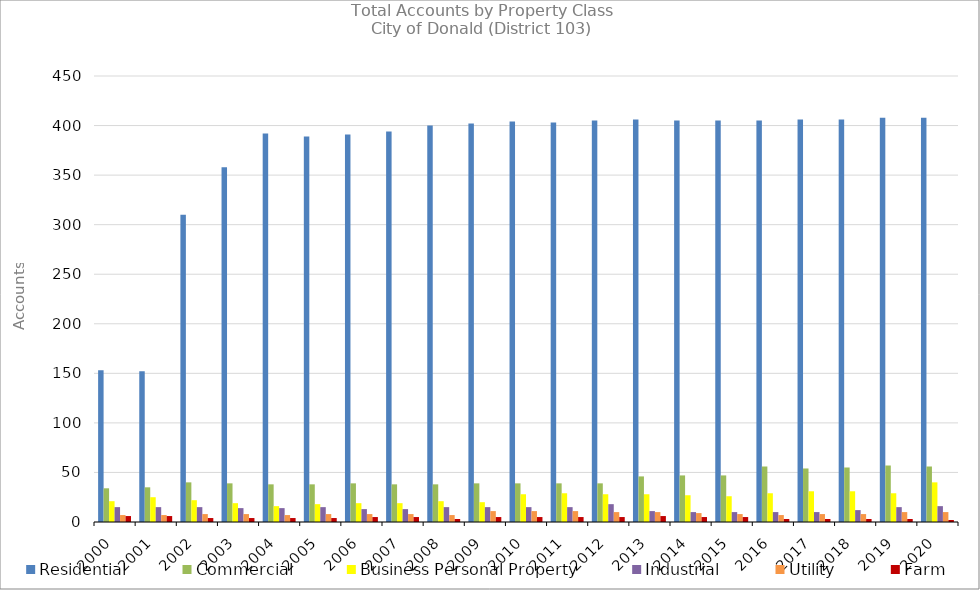
| Category | Residential | Commercial | Business Personal Property | Industrial | Utility | Farm |
|---|---|---|---|---|---|---|
| 2000.0 | 153 | 34 | 21 | 15 | 7 | 6 |
| 2001.0 | 152 | 35 | 25 | 15 | 7 | 6 |
| 2002.0 | 310 | 40 | 22 | 15 | 8 | 4 |
| 2003.0 | 358 | 39 | 19 | 14 | 8 | 4 |
| 2004.0 | 392 | 38 | 16 | 14 | 7 | 4 |
| 2005.0 | 389 | 38 | 18 | 15 | 8 | 4 |
| 2006.0 | 391 | 39 | 19 | 13 | 8 | 5 |
| 2007.0 | 394 | 38 | 19 | 13 | 8 | 5 |
| 2008.0 | 400 | 38 | 21 | 15 | 7 | 3 |
| 2009.0 | 402 | 39 | 20 | 15 | 11 | 5 |
| 2010.0 | 404 | 39 | 28 | 15 | 11 | 5 |
| 2011.0 | 403 | 39 | 29 | 15 | 11 | 5 |
| 2012.0 | 405 | 39 | 28 | 18 | 10 | 5 |
| 2013.0 | 406 | 46 | 28 | 11 | 10 | 6 |
| 2014.0 | 405 | 47 | 27 | 10 | 9 | 5 |
| 2015.0 | 405 | 47 | 26 | 10 | 8 | 5 |
| 2016.0 | 405 | 56 | 29 | 10 | 7 | 3 |
| 2017.0 | 406 | 54 | 31 | 10 | 8 | 3 |
| 2018.0 | 406 | 55 | 31 | 12 | 8 | 3 |
| 2019.0 | 408 | 57 | 29 | 15 | 10 | 3 |
| 2020.0 | 408 | 56 | 40 | 16 | 10 | 2 |